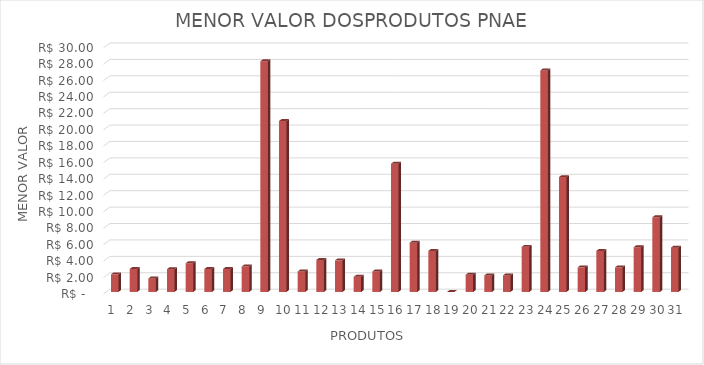
| Category | Series 0 |
|---|---|
| 0 | 2.15 |
| 1 | 2.8 |
| 2 | 1.65 |
| 3 | 2.78 |
| 4 | 3.5 |
| 5 | 2.8 |
| 6 | 2.8 |
| 7 | 3.1 |
| 8 | 28.12 |
| 9 | 20.83 |
| 10 | 2.5 |
| 11 | 3.9 |
| 12 | 3.85 |
| 13 | 1.85 |
| 14 | 2.5 |
| 15 | 15.62 |
| 16 | 6 |
| 17 | 5 |
| 18 | 0 |
| 19 | 2.1 |
| 20 | 2.02 |
| 21 | 2.02 |
| 22 | 5.5 |
| 23 | 27 |
| 24 | 14 |
| 25 | 3 |
| 26 | 5 |
| 27 | 3 |
| 28 | 5.45 |
| 29 | 9.1 |
| 30 | 5.4 |